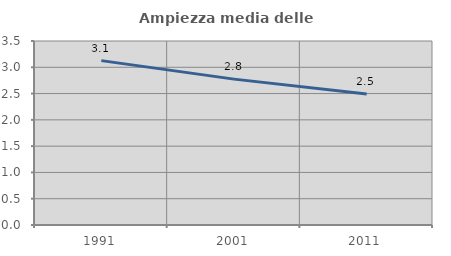
| Category | Ampiezza media delle famiglie |
|---|---|
| 1991.0 | 3.127 |
| 2001.0 | 2.775 |
| 2011.0 | 2.493 |